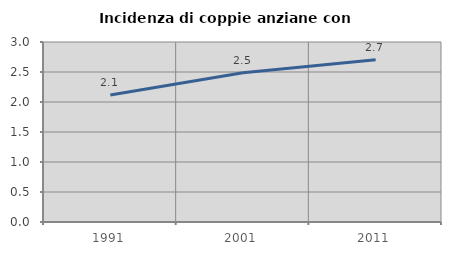
| Category | Incidenza di coppie anziane con figli |
|---|---|
| 1991.0 | 2.116 |
| 2001.0 | 2.488 |
| 2011.0 | 2.703 |